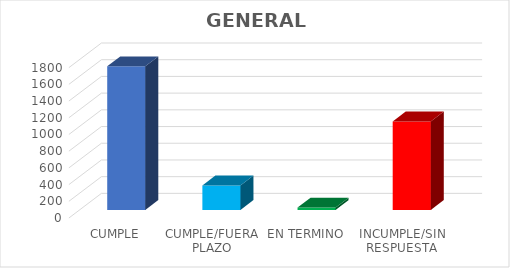
| Category | Series 0 |
|---|---|
| CUMPLE | 1720 |
| CUMPLE/FUERA PLAZO | 293 |
| EN TERMINO | 28 |
| INCUMPLE/SIN RESPUESTA | 1059 |